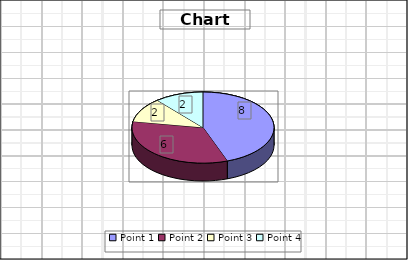
| Category | Series 1 |
|---|---|
| Point 1 | 8 |
| Point 2 | 6 |
| Point 3 | 2 |
| Point 4 | 2 |